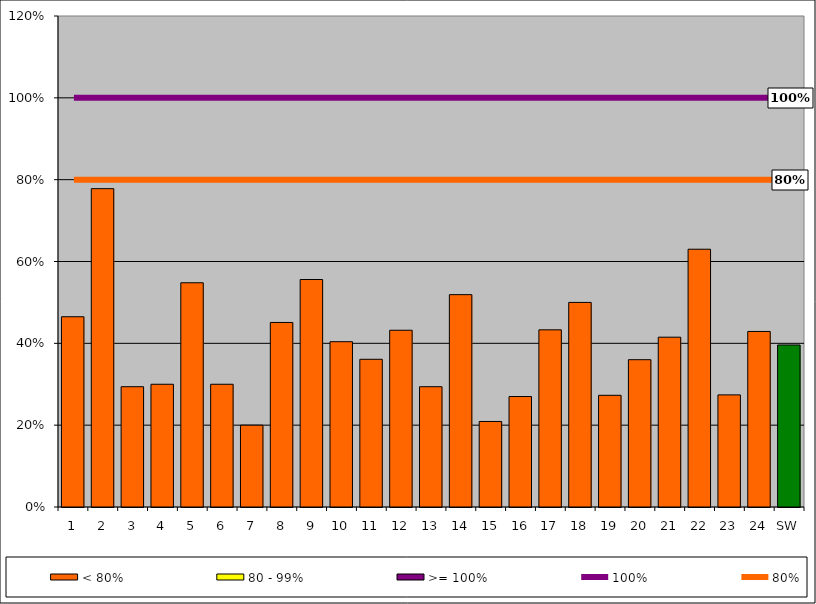
| Category | < 80% | 80 - 99% | >= 100% |
|---|---|---|---|
| 1 | 0.465 | 0 | 0 |
| 2 | 0.778 | 0 | 0 |
| 3 | 0.294 | 0 | 0 |
| 4 | 0.3 | 0 | 0 |
| 5 | 0.548 | 0 | 0 |
| 6 | 0.3 | 0 | 0 |
| 7 | 0.2 | 0 | 0 |
| 8 | 0.451 | 0 | 0 |
| 9 | 0.556 | 0 | 0 |
| 10 | 0.404 | 0 | 0 |
| 11 | 0.361 | 0 | 0 |
| 12 | 0.432 | 0 | 0 |
| 13 | 0.294 | 0 | 0 |
| 14 | 0.519 | 0 | 0 |
| 15 | 0.209 | 0 | 0 |
| 16 | 0.27 | 0 | 0 |
| 17 | 0.433 | 0 | 0 |
| 18 | 0.5 | 0 | 0 |
| 19 | 0.273 | 0 | 0 |
| 20 | 0.36 | 0 | 0 |
| 21 | 0.415 | 0 | 0 |
| 22 | 0.63 | 0 | 0 |
| 23 | 0.274 | 0 | 0 |
| 24 | 0.429 | 0 | 0 |
| SW | 0.396 | 0 | 0 |